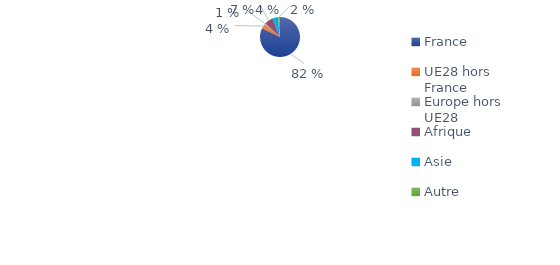
| Category | Series 0 |
|---|---|
| France | 0.823 |
| UE28 hors France | 0.038 |
| Europe hors UE28 | 0.008 |
| Afrique | 0.071 |
| Asie | 0.043 |
| Autre | 0.017 |